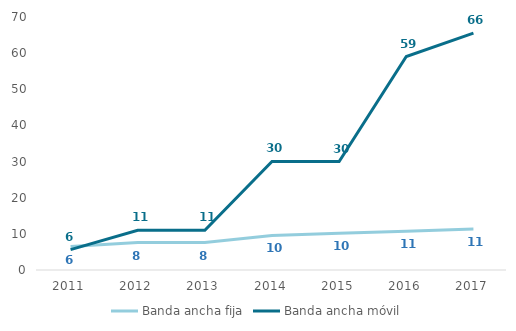
| Category | Banda ancha fija | Banda ancha móvil |
|---|---|---|
| 2011.0 | 6.48 | 5.64 |
| 2012.0 | 7.58 | 11.01 |
| 2013.0 | 7.58 | 11.01 |
| 2014.0 | 9.55 | 30.04 |
| 2015.0 | 10.2 | 30 |
| 2016.0 | 10.69 | 59.06 |
| 2017.0 | 11.35 | 65.53 |